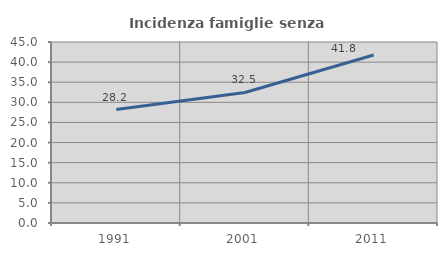
| Category | Incidenza famiglie senza nuclei |
|---|---|
| 1991.0 | 28.192 |
| 2001.0 | 32.455 |
| 2011.0 | 41.756 |